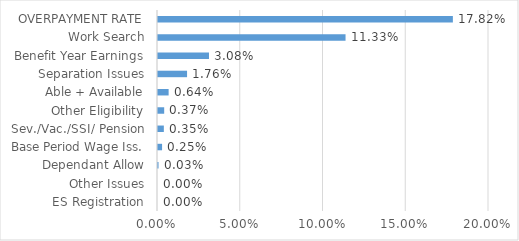
| Category | Series 0 |
|---|---|
| ES Registration | 0 |
| Other Issues | 0 |
| Dependant Allow | 0 |
| Base Period Wage Iss. | 0.002 |
| Sev./Vac./SSI/ Pension | 0.004 |
| Other Eligibility | 0.004 |
| Able + Available | 0.006 |
| Separation Issues | 0.018 |
| Benefit Year Earnings | 0.031 |
| Work Search | 0.113 |
| OVERPAYMENT RATE | 0.178 |